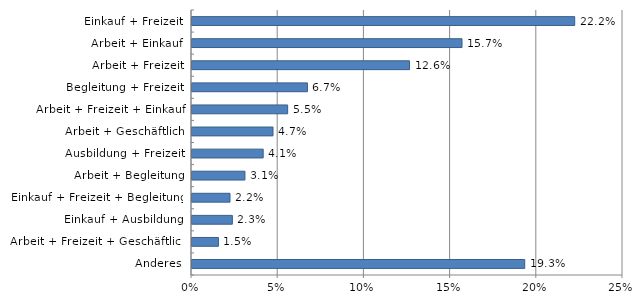
| Category | Series 0 |
|---|---|
| Einkauf + Freizeit | 22.199 |
| Arbeit + Einkauf | 15.662 |
| Arbeit + Freizeit | 12.617 |
| Begleitung + Freizeit | 6.695 |
| Arbeit + Freizeit + Einkauf | 5.548 |
| Arbeit + Geschäftlich | 4.699 |
| Ausbildung + Freizeit | 4.13 |
| Arbeit + Begleitung | 3.071 |
| Einkauf + Freizeit + Begleitung | 2.205 |
| Einkauf + Ausbildung | 2.341 |
| Arbeit + Freizeit + Geschäftlich | 1.532 |
| Anderes | 19.3 |